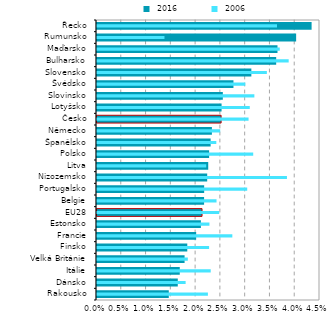
| Category |  2016 |
|---|---|
| Rakousko | 0.014 |
| Dánsko | 0.016 |
| Itálie | 0.017 |
| Velká Británie | 0.018 |
| Finsko | 0.018 |
| Francie | 0.02 |
| Estonsko | 0.021 |
| EU28 | 0.021 |
| Belgie | 0.022 |
| Portugalsko | 0.022 |
| Nizozemsko | 0.022 |
| Litva | 0.022 |
| Polsko | 0.023 |
| Španělsko | 0.023 |
| Německo | 0.023 |
| Česko | 0.025 |
| Lotyšsko | 0.025 |
| Slovinsko | 0.025 |
| Švédsko | 0.028 |
| Slovensko | 0.031 |
| Bulharsko | 0.036 |
| Maďarsko | 0.036 |
| Rumunsko | 0.04 |
| Řecko | 0.043 |